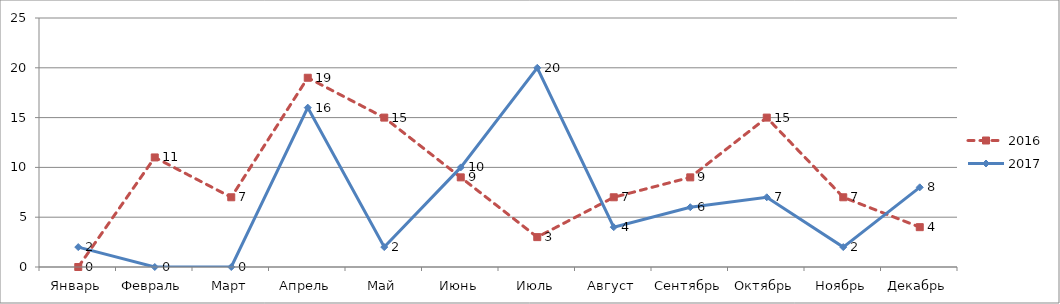
| Category | 2016 | 2017 |
|---|---|---|
| Январь | 0 | 2 |
| Февраль | 11 | 0 |
| Март | 7 | 0 |
| Апрель | 19 | 16 |
| Май | 15 | 2 |
| Июнь | 9 | 10 |
| Июль | 3 | 20 |
| Август | 7 | 4 |
| Сентябрь | 9 | 6 |
| Октябрь | 15 | 7 |
| Ноябрь | 7 | 2 |
| Декабрь | 4 | 8 |